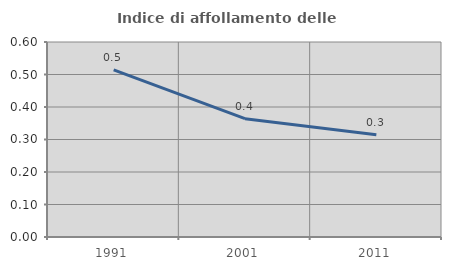
| Category | Indice di affollamento delle abitazioni  |
|---|---|
| 1991.0 | 0.514 |
| 2001.0 | 0.364 |
| 2011.0 | 0.315 |